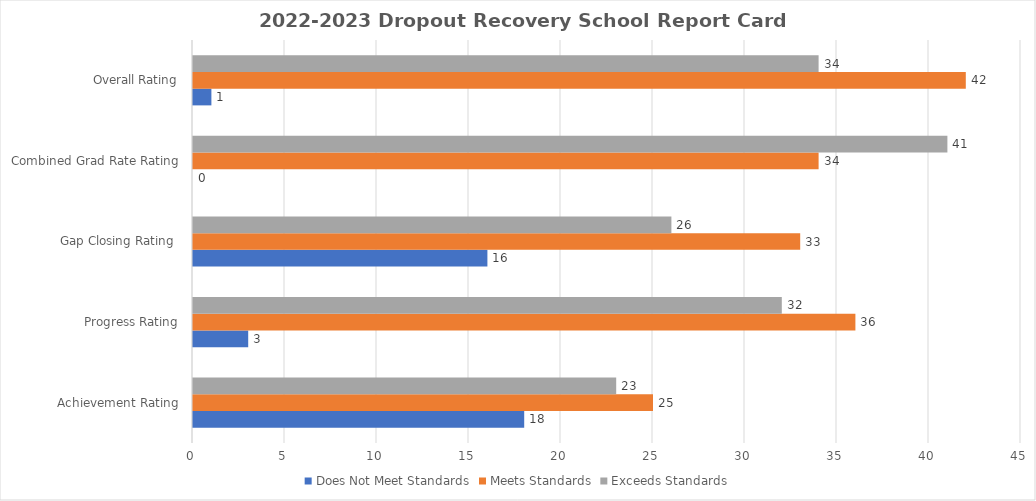
| Category | Does Not Meet Standards | Meets Standards | Exceeds Standards |
|---|---|---|---|
| Achievement Rating | 18 | 25 | 23 |
| Progress Rating | 3 | 36 | 32 |
| Gap Closing Rating  | 16 | 33 | 26 |
| Combined Grad Rate Rating | 0 | 34 | 41 |
| Overall Rating | 1 | 42 | 34 |